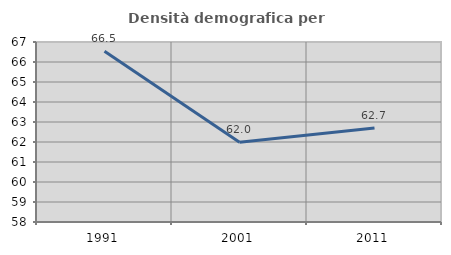
| Category | Densità demografica |
|---|---|
| 1991.0 | 66.538 |
| 2001.0 | 61.984 |
| 2011.0 | 62.695 |